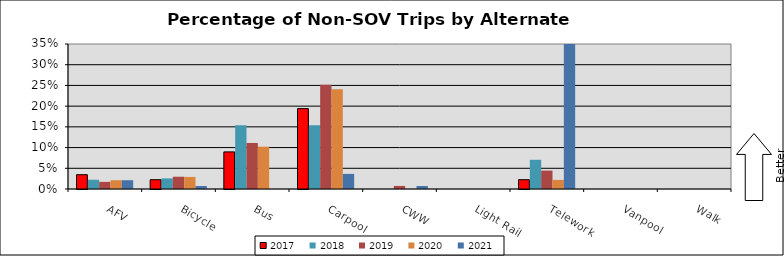
| Category | 2017 | 2018 | 2019 | 2020 | 2021 |
|---|---|---|---|---|---|
| AFV | 0.034 | 0.022 | 0.017 | 0.021 | 0.021 |
| Bicycle | 0.022 | 0.026 | 0.03 | 0.029 | 0.007 |
| Bus | 0.09 | 0.154 | 0.111 | 0.102 | 0 |
| Carpool | 0.194 | 0.154 | 0.252 | 0.241 | 0.036 |
| CWW | 0 | 0 | 0.007 | 0 | 0.007 |
| Light Rail | 0 | 0 | 0 | 0 | 0 |
| Telework | 0.022 | 0.071 | 0.044 | 0.022 | 0.569 |
| Vanpool | 0 | 0 | 0 | 0 | 0 |
| Walk | 0 | 0 | 0 | 0 | 0 |